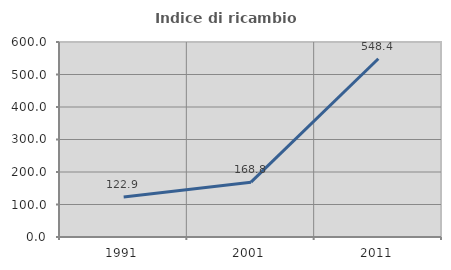
| Category | Indice di ricambio occupazionale  |
|---|---|
| 1991.0 | 122.857 |
| 2001.0 | 168.75 |
| 2011.0 | 548.387 |